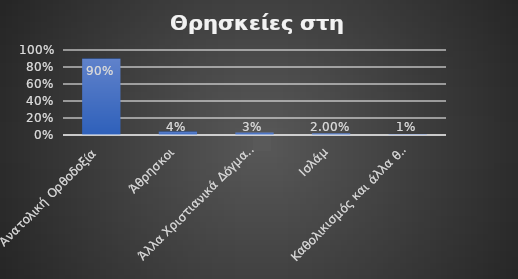
| Category | Series 0 |
|---|---|
| Ανατολική Ορθοδοξία | 0.9 |
| Άθρησκοι | 0.04 |
| Άλλα Χριστιανικά Δόγματα (πλην Καθολικισμού) | 0.03 |
| Ισλάμ | 0.02 |
| Καθολικισμός και άλλα θρησκεύματα | 0.01 |